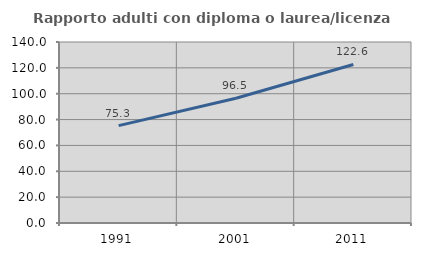
| Category | Rapporto adulti con diploma o laurea/licenza media  |
|---|---|
| 1991.0 | 75.302 |
| 2001.0 | 96.522 |
| 2011.0 | 122.625 |